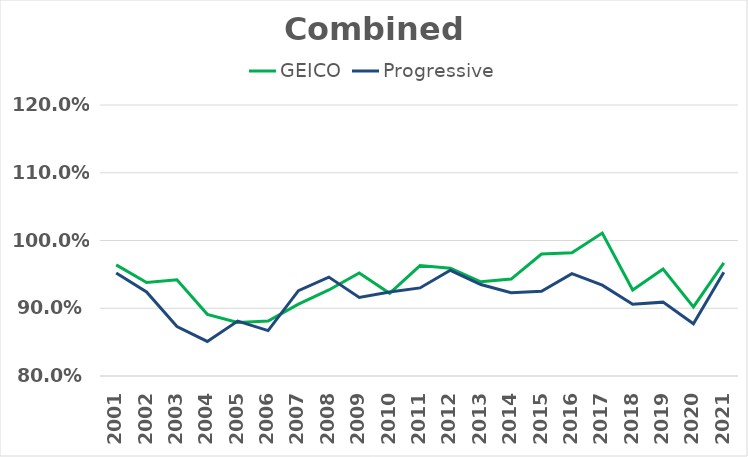
| Category | GEICO | Progressive |
|---|---|---|
| 2001.0 | 0.964 | 0.952 |
| 2002.0 | 0.938 | 0.924 |
| 2003.0 | 0.942 | 0.873 |
| 2004.0 | 0.891 | 0.851 |
| 2005.0 | 0.879 | 0.881 |
| 2006.0 | 0.881 | 0.867 |
| 2007.0 | 0.906 | 0.926 |
| 2008.0 | 0.927 | 0.946 |
| 2009.0 | 0.952 | 0.916 |
| 2010.0 | 0.922 | 0.924 |
| 2011.0 | 0.963 | 0.93 |
| 2012.0 | 0.959 | 0.956 |
| 2013.0 | 0.939 | 0.935 |
| 2014.0 | 0.943 | 0.923 |
| 2015.0 | 0.98 | 0.925 |
| 2016.0 | 0.982 | 0.951 |
| 2017.0 | 1.011 | 0.934 |
| 2018.0 | 0.927 | 0.906 |
| 2019.0 | 0.958 | 0.909 |
| 2020.0 | 0.902 | 0.877 |
| 2021.0 | 0.967 | 0.953 |